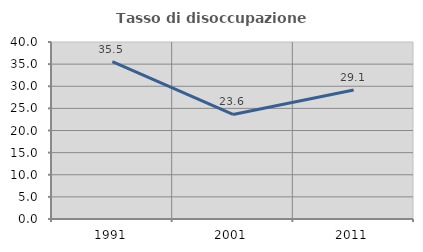
| Category | Tasso di disoccupazione giovanile  |
|---|---|
| 1991.0 | 35.54 |
| 2001.0 | 23.618 |
| 2011.0 | 29.143 |